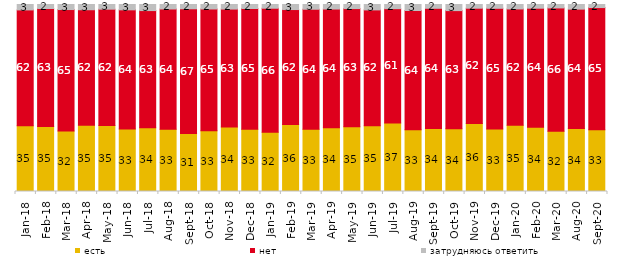
| Category | есть | нет | затрудняюсь ответить |
|---|---|---|---|
| 2018-01-01 | 35.2 | 61.9 | 2.9 |
| 2018-02-01 | 34.8 | 63.05 | 2.15 |
| 2018-03-01 | 32.35 | 64.95 | 2.7 |
| 2018-04-01 | 35.45 | 61.75 | 2.8 |
| 2018-05-01 | 35.3 | 62.15 | 2.5 |
| 2018-06-01 | 33.45 | 63.7 | 2.85 |
| 2018-07-01 | 34.05 | 62.7 | 3.25 |
| 2018-08-01 | 33.3 | 64.3 | 2.4 |
| 2018-09-01 | 31 | 66.7 | 2.3 |
| 2018-10-01 | 32.55 | 65.05 | 2.4 |
| 2018-11-01 | 34.431 | 63.124 | 2.445 |
| 2018-12-01 | 33.25 | 64.6 | 2.15 |
| 2019-01-01 | 31.75 | 66.25 | 2 |
| 2019-02-01 | 35.8 | 61.5 | 2.7 |
| 2019-03-01 | 33.317 | 64.147 | 2.536 |
| 2019-04-01 | 34.059 | 63.515 | 2.426 |
| 2019-05-01 | 34.621 | 63.2 | 2.179 |
| 2019-06-01 | 35.162 | 61.945 | 2.893 |
| 2019-07-01 | 36.634 | 61.139 | 2.228 |
| 2019-08-01 | 33.067 | 63.736 | 3.197 |
| 2019-09-01 | 33.713 | 64.257 | 2.03 |
| 2019-10-01 | 33.564 | 63.168 | 3.267 |
| 2019-11-01 | 36.337 | 61.683 | 1.98 |
| 2019-12-01 | 33.416 | 64.554 | 2.03 |
| 2020-01-01 | 35.446 | 62.178 | 2.376 |
| 2020-02-01 | 34.307 | 63.713 | 1.98 |
| 2020-03-01 | 32.226 | 65.94 | 1.834 |
| 2020-08-01 | 33.664 | 63.853 | 2.483 |
| 2020-09-01 | 33.051 | 65.306 | 1.643 |